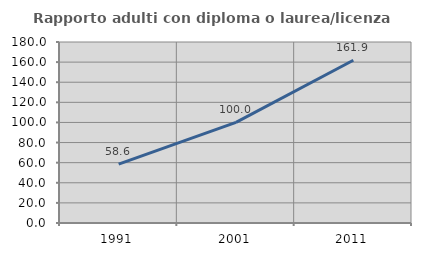
| Category | Rapporto adulti con diploma o laurea/licenza media  |
|---|---|
| 1991.0 | 58.601 |
| 2001.0 | 100 |
| 2011.0 | 161.882 |